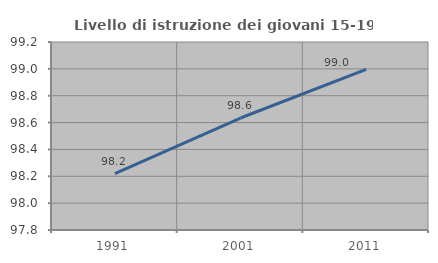
| Category | Livello di istruzione dei giovani 15-19 anni |
|---|---|
| 1991.0 | 98.221 |
| 2001.0 | 98.634 |
| 2011.0 | 98.997 |